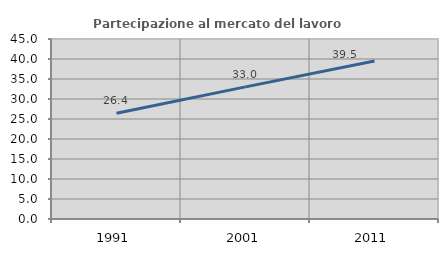
| Category | Partecipazione al mercato del lavoro  femminile |
|---|---|
| 1991.0 | 26.446 |
| 2001.0 | 33.025 |
| 2011.0 | 39.486 |